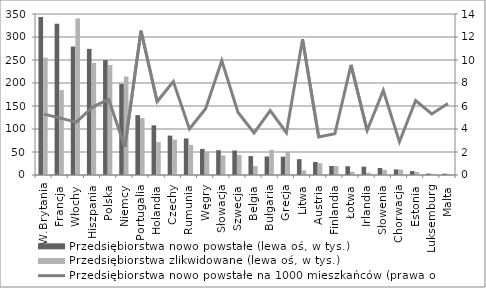
| Category | Przedsiębiorstwa nowo powstałe (lewa oś, w tys.) | Przedsiębiorstwa zlikwidowane (lewa oś, w tys.) |
|---|---|---|
| W.Brytania | 343.555 | 255.145 |
| Francja | 328.884 | 184.767 |
| Włochy | 279.132 | 339.955 |
| Hiszpania | 274.172 | 243.842 |
| Polska | 249.815 | 239.265 |
| Niemcy | 198.135 | 214.052 |
| Portugalia | 130.156 | 123.771 |
| Holandia | 107.946 | 71.371 |
| Czechy | 85.645 | 77.02 |
| Rumunia | 79.496 | 65.461 |
| Węgry | 56.799 | 50.166 |
| Słowacja | 53.899 | 42.655 |
| Szwecja | 53.185 | 43.686 |
| Belgia | 41.102 | 19.385 |
| Bułgaria | 40.358 | 54.782 |
| Grecja | 39.896 | 50.164 |
| Litwa | 34.49 | 10.086 |
| Austria | 28.311 | 25.422 |
| Finlandia | 19.623 | 19.448 |
| Łotwa | 19.003 | 6.922 |
| Irlandia | 18.1 | 4.979 |
| Słowenia | 15.154 | 10.919 |
| Chorwacja | 12.185 | 11.73 |
| Estonia | 8.512 | 6.399 |
| Luksemburg | 2.989 | 2.485 |
| Malta | 2.73 | 0.834 |